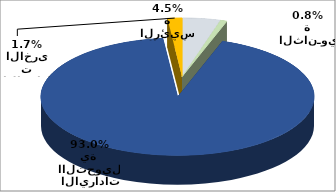
| Category | Series 0 |
|---|---|
| الايرادات الرئيسة | 136024884 |
| الايـرادات الثانـوية | 23463715 |
| الايرادات االتحويلية | 2789899227 |
| الايرادات الاخرى | 51637756 |